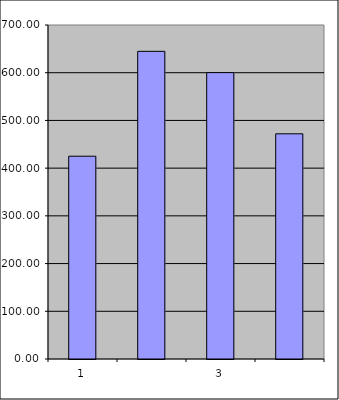
| Category | Series 0 |
|---|---|
| 0 | 425 |
| 1 | 644.811 |
| 2 | 600.188 |
| 3 | 471.963 |